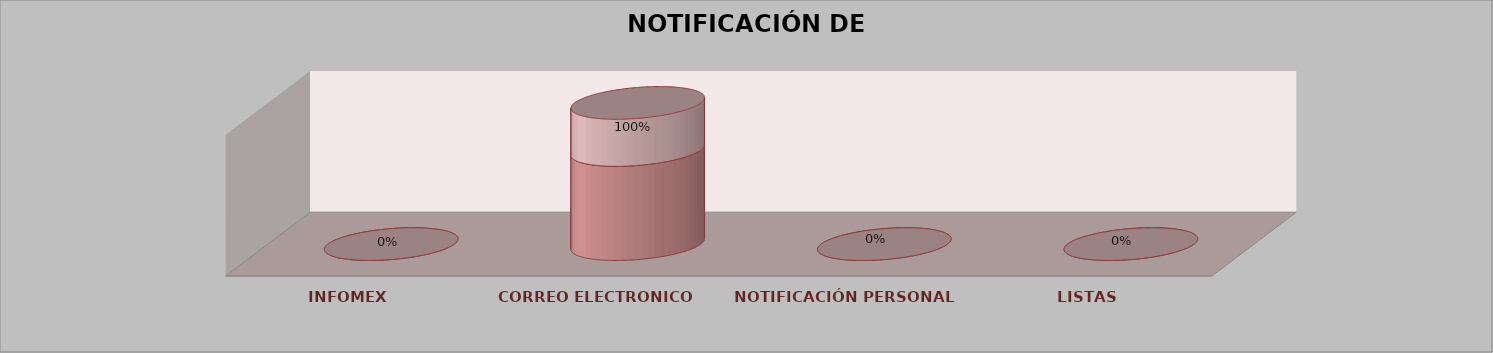
| Category | Series 0 | Series 1 | Series 2 | Series 3 | Series 4 |
|---|---|---|---|---|---|
| INFOMEX |  |  |  | 0 | 0 |
| CORREO ELECTRONICO |  |  |  | 2 | 1 |
| NOTIFICACIÓN PERSONAL |  |  |  | 0 | 0 |
| LISTAS |  |  |  | 0 | 0 |